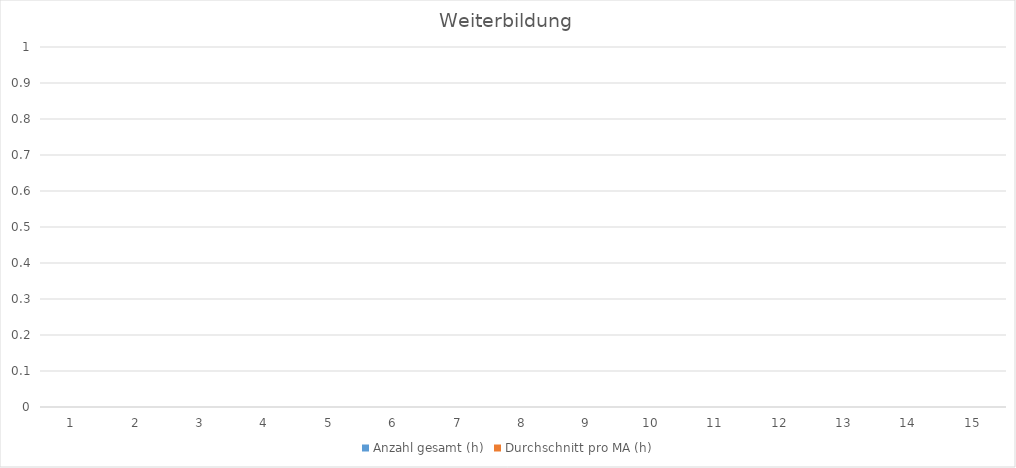
| Category | Anzahl gesamt (h) | Durchschnitt pro MA (h) |
|---|---|---|
| 0 | 0 | 0 |
| 1 | 0 | 0 |
| 2 | 0 | 0 |
| 3 | 0 | 0 |
| 4 | 0 | 0 |
| 5 | 0 | 0 |
| 6 | 0 | 0 |
| 7 | 0 | 0 |
| 8 | 0 | 0 |
| 9 | 0 | 0 |
| 10 | 0 | 0 |
| 11 | 0 | 0 |
| 12 | 0 | 0 |
| 13 | 0 | 0 |
| 14 | 0 | 0 |